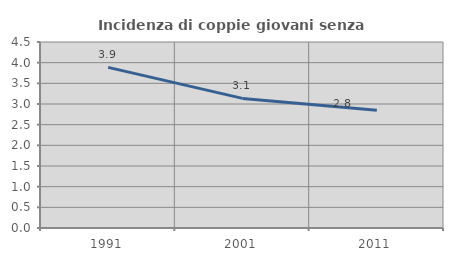
| Category | Incidenza di coppie giovani senza figli |
|---|---|
| 1991.0 | 3.887 |
| 2001.0 | 3.136 |
| 2011.0 | 2.846 |